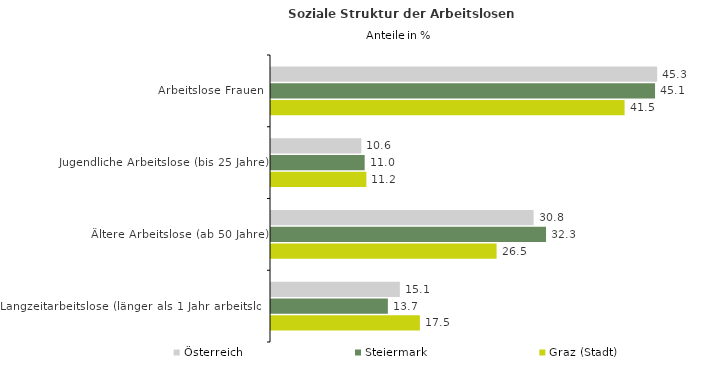
| Category | Österreich | Steiermark | Graz (Stadt) |
|---|---|---|---|
| Arbeitslose Frauen | 45.325 | 45.075 | 41.501 |
| Jugendliche Arbeitslose (bis 25 Jahre) | 10.608 | 10.993 | 11.191 |
| Ältere Arbeitslose (ab 50 Jahre) | 30.822 | 32.281 | 26.481 |
| Langzeitarbeitslose (länger als 1 Jahr arbeitslos) | 15.122 | 13.717 | 17.474 |